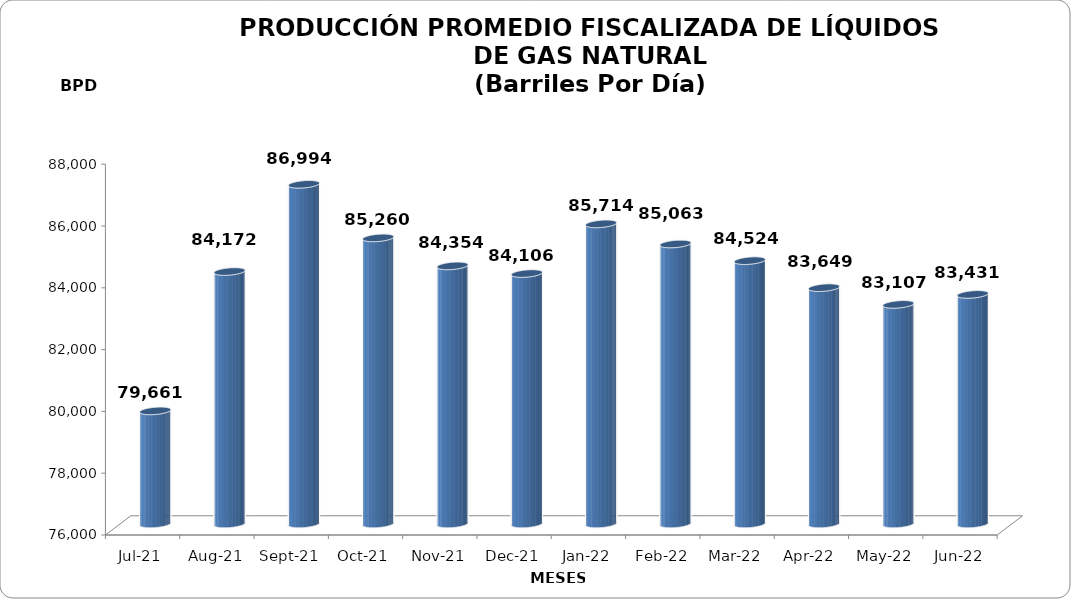
| Category | Series 0 |
|---|---|
| 2021-07-01 | 79661.29 |
| 2021-08-01 | 84171.548 |
| 2021-09-01 | 86994 |
| 2021-10-01 | 85260 |
| 2021-11-01 | 84354 |
| 2021-12-01 | 84106 |
| 2022-01-01 | 85714.355 |
| 2022-02-01 | 85063 |
| 2022-03-01 | 84523.548 |
| 2022-04-01 | 83649 |
| 2022-05-01 | 83107.387 |
| 2022-06-01 | 83430.867 |